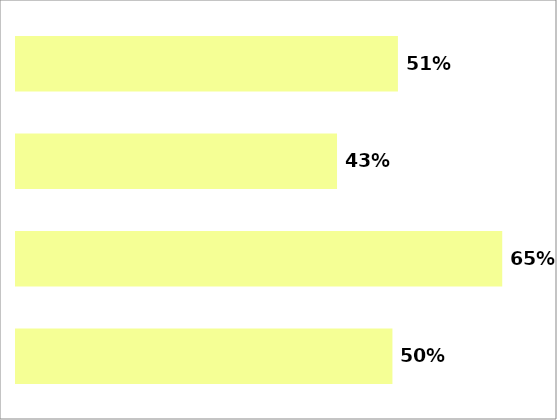
| Category | Series 0 |
|---|---|
| 0 | 0.507 |
| 1 | 0.426 |
| 2 | 0.646 |
| 3 | 0.5 |